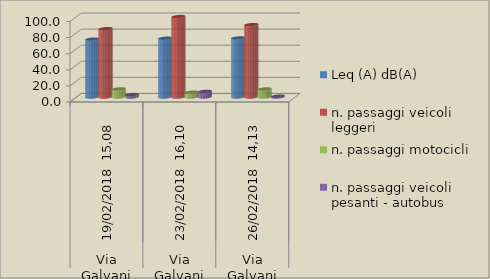
| Category | Leq (A) dB(A) | n. passaggi veicoli leggeri  | n. passaggi motocicli | n. passaggi veicoli pesanti - autobus  |
|---|---|---|---|---|
| 0 | 72 | 85 | 10 | 3 |
| 1 | 73.1 | 100 | 6 | 7 |
| 2 | 73.4 | 90 | 10 | 1 |